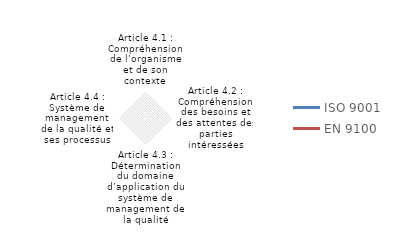
| Category | ISO 9001 | EN 9100 |
|---|---|---|
| Article 4.1 : Compréhension de l’organisme et de son contexte | 0 | 0 |
| Article 4.2 : Compréhension des besoins et des attentes des parties intéressées | 0 | 0 |
| Article 4.3 : Détermination du domaine d’application du système de management de la qualité | 0 | 0 |
| Article 4.4 : Système de management de la qualité et ses processus | 0 | 0 |